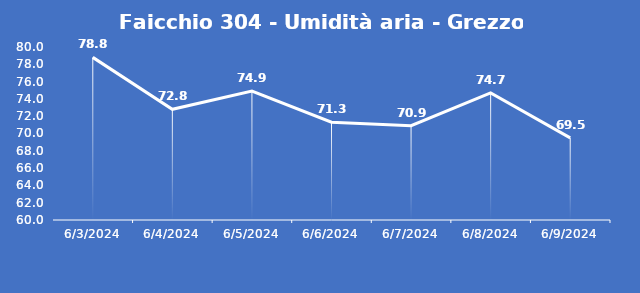
| Category | Faicchio 304 - Umidità aria - Grezzo (%) |
|---|---|
| 6/3/24 | 78.8 |
| 6/4/24 | 72.8 |
| 6/5/24 | 74.9 |
| 6/6/24 | 71.3 |
| 6/7/24 | 70.9 |
| 6/8/24 | 74.7 |
| 6/9/24 | 69.5 |